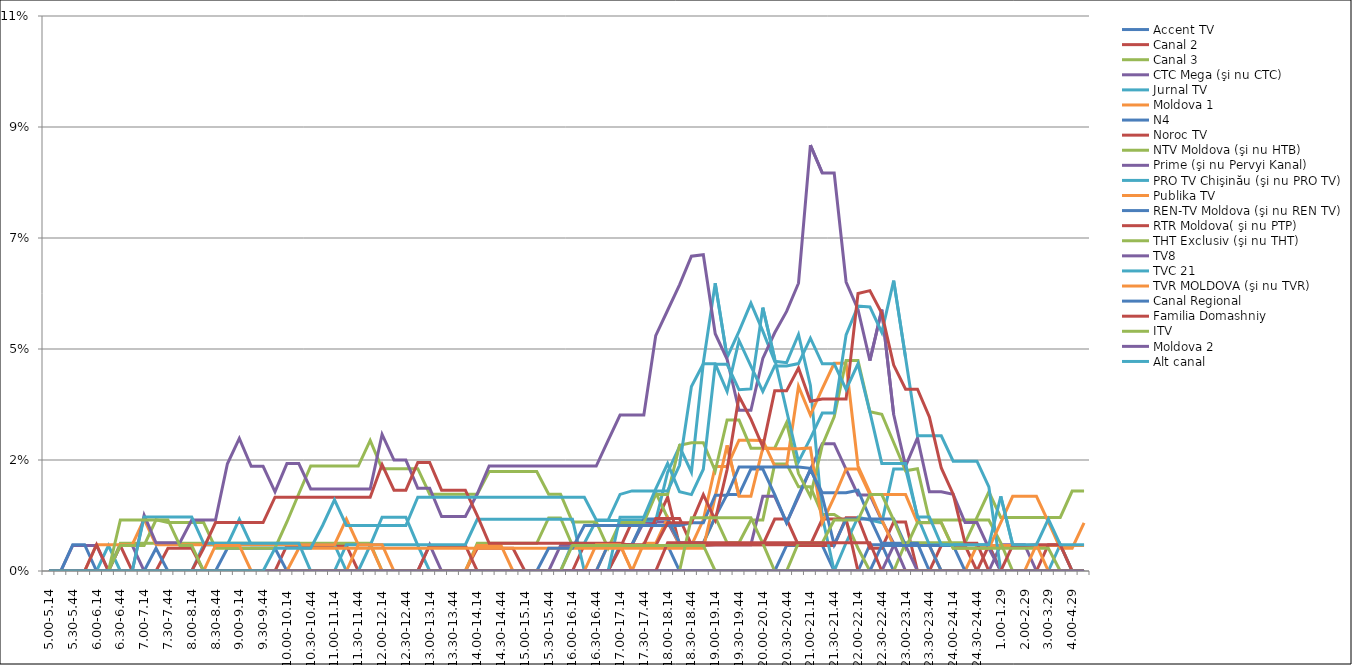
| Category | Accent TV | Canal 2 | Canal 3 | CTC Mega (şi nu CTC) | Jurnal TV | Moldova 1 | N4 | Noroc TV | NTV Moldova (şi nu HTB) | Prime (şi nu Pervyi Kanal) | PRO TV Chişinău (şi nu PRO TV) | Publika TV  | REN-TV Moldova (şi nu REN TV)  | RTR Moldova( şi nu PTP)  | THT Exclusiv (şi nu THT) | TV8 | TVC 21 | TVR MOLDOVA (şi nu TVR) | Canal Regional | Familia Domashniy | ITV | Moldova 2 | Alt canal |
|---|---|---|---|---|---|---|---|---|---|---|---|---|---|---|---|---|---|---|---|---|---|---|---|
| 5.00-5.14 | 0 | 0 | 0 | 0 | 0 | 0 | 0 | 0 | 0 | 0 | 0 | 0 | 0 | 0 | 0 | 0 | 0 | 0 | 0 | 0 | 0 | 0 | 0 |
| 5.15-5.29 | 0 | 0 | 0 | 0 | 0 | 0 | 0 | 0 | 0 | 0 | 0 | 0 | 0 | 0 | 0 | 0 | 0 | 0 | 0 | 0 | 0 | 0 | 0 |
| 5.30-5.44 | 0 | 0 | 0 | 0 | 0 | 0 | 0 | 0 | 0 | 0.005 | 0 | 0 | 0.005 | 0 | 0 | 0 | 0 | 0 | 0 | 0 | 0 | 0 | 0 |
| 5.45-5.59 | 0 | 0 | 0 | 0 | 0 | 0 | 0 | 0 | 0 | 0.005 | 0 | 0 | 0.005 | 0 | 0 | 0 | 0 | 0 | 0 | 0 | 0 | 0 | 0 |
| 6.00-6.14 | 0 | 0 | 0 | 0 | 0 | 0.005 | 0 | 0 | 0 | 0.005 | 0 | 0 | 0 | 0.005 | 0 | 0 | 0 | 0 | 0 | 0 | 0 | 0 | 0 |
| 6.15-6.29 | 0 | 0 | 0 | 0 | 0.005 | 0.005 | 0 | 0 | 0 | 0 | 0 | 0 | 0 | 0 | 0 | 0 | 0 | 0 | 0 | 0 | 0 | 0 | 0 |
| 6.30-6.44 | 0 | 0.005 | 0.006 | 0.005 | 0 | 0.005 | 0 | 0 | 0.005 | 0 | 0 | 0 | 0 | 0 | 0.01 | 0 | 0 | 0 | 0 | 0 | 0 | 0 | 0 |
| 6.45-6.59 | 0 | 0 | 0.006 | 0.005 | 0 | 0.005 | 0 | 0 | 0.005 | 0 | 0 | 0 | 0 | 0 | 0.01 | 0 | 0 | 0 | 0 | 0 | 0 | 0 | 0 |
| 7.00-7.14 | 0 | 0 | 0.006 | 0 | 0 | 0.01 | 0 | 0 | 0.005 | 0.011 | 0.011 | 0 | 0 | 0 | 0.01 | 0 | 0 | 0 | 0 | 0 | 0 | 0 | 0 |
| 7.15-7.29 | 0 | 0 | 0.006 | 0 | 0 | 0.005 | 0 | 0 | 0.01 | 0.006 | 0.011 | 0 | 0.005 | 0 | 0.01 | 0 | 0 | 0 | 0 | 0 | 0 | 0 | 0 |
| 7.30-7.44 | 0 | 0.005 | 0.006 | 0 | 0 | 0.005 | 0 | 0 | 0.01 | 0.006 | 0.011 | 0 | 0 | 0 | 0.01 | 0 | 0 | 0 | 0 | 0 | 0 | 0 | 0 |
| 7.45-7.59 | 0 | 0.005 | 0.006 | 0 | 0 | 0.005 | 0 | 0 | 0.01 | 0.006 | 0.011 | 0 | 0 | 0 | 0.005 | 0 | 0 | 0 | 0 | 0 | 0 | 0 | 0 |
| 8.00-8.14 | 0 | 0.005 | 0.006 | 0 | 0 | 0.005 | 0 | 0 | 0.01 | 0.01 | 0.011 | 0 | 0 | 0 | 0.005 | 0 | 0 | 0 | 0 | 0 | 0 | 0 | 0 |
| 8.15-8.29 | 0 | 0 | 0.006 | 0 | 0.005 | 0.005 | 0 | 0 | 0.01 | 0.01 | 0.006 | 0 | 0 | 0.005 | 0 | 0 | 0 | 0 | 0 | 0 | 0 | 0 | 0 |
| 8.30-8.44 | 0 | 0 | 0.006 | 0 | 0.005 | 0.005 | 0 | 0 | 0.005 | 0.01 | 0.006 | 0.005 | 0 | 0.01 | 0 | 0 | 0 | 0 | 0 | 0 | 0 | 0 | 0 |
| 8.45-8.59 | 0 | 0 | 0.006 | 0 | 0.005 | 0.005 | 0.005 | 0 | 0.005 | 0.022 | 0.006 | 0.005 | 0 | 0.01 | 0 | 0 | 0 | 0 | 0 | 0 | 0 | 0 | 0 |
| 9.00-9.14 | 0 | 0 | 0.006 | 0 | 0.01 | 0.005 | 0.005 | 0 | 0.005 | 0.027 | 0.006 | 0.005 | 0 | 0.01 | 0 | 0 | 0 | 0 | 0 | 0 | 0 | 0 | 0 |
| 9.15-9.29 | 0 | 0 | 0.006 | 0 | 0.005 | 0.005 | 0.005 | 0 | 0.005 | 0.021 | 0.006 | 0 | 0 | 0.01 | 0 | 0 | 0 | 0 | 0 | 0 | 0 | 0 | 0 |
| 9.30-9.44 | 0 | 0 | 0.006 | 0 | 0.005 | 0.005 | 0.005 | 0 | 0.005 | 0.021 | 0.006 | 0 | 0 | 0.01 | 0 | 0 | 0 | 0 | 0 | 0 | 0 | 0 | 0 |
| 9.45-9.59 | 0 | 0 | 0.006 | 0 | 0.005 | 0.005 | 0.005 | 0 | 0.005 | 0.016 | 0.006 | 0 | 0 | 0.015 | 0 | 0 | 0 | 0 | 0 | 0 | 0 | 0 | 0.005 |
| 10.00-10.14 | 0 | 0.005 | 0.006 | 0 | 0.005 | 0.005 | 0 | 0 | 0.01 | 0.022 | 0.006 | 0 | 0 | 0.015 | 0 | 0 | 0 | 0 | 0 | 0 | 0 | 0 | 0.005 |
| 10.15-10.29 | 0 | 0.005 | 0.006 | 0 | 0.005 | 0.005 | 0 | 0 | 0.016 | 0.022 | 0.006 | 0.005 | 0 | 0.015 | 0 | 0 | 0 | 0 | 0 | 0 | 0 | 0 | 0.005 |
| 10.30-10.44 | 0 | 0.005 | 0.006 | 0 | 0.005 | 0.005 | 0 | 0 | 0.021 | 0.017 | 0 | 0.005 | 0 | 0.015 | 0 | 0 | 0 | 0 | 0 | 0 | 0 | 0 | 0.005 |
| 10.45-10.59 | 0 | 0.005 | 0.006 | 0 | 0.005 | 0.005 | 0 | 0 | 0.021 | 0.017 | 0 | 0.005 | 0 | 0.015 | 0 | 0 | 0 | 0 | 0 | 0 | 0 | 0 | 0.009 |
| 11.00-11.14 | 0 | 0.005 | 0.006 | 0 | 0.005 | 0.005 | 0 | 0 | 0.021 | 0.017 | 0 | 0.005 | 0 | 0.015 | 0 | 0 | 0 | 0 | 0 | 0 | 0 | 0 | 0.014 |
| 11.15-11.29 | 0 | 0.005 | 0.006 | 0 | 0 | 0.011 | 0 | 0 | 0.021 | 0.017 | 0.005 | 0.005 | 0 | 0.015 | 0 | 0 | 0 | 0 | 0 | 0 | 0 | 0 | 0.009 |
| 11.30-11.44 | 0 | 0 | 0.006 | 0 | 0 | 0.005 | 0 | 0 | 0.021 | 0.017 | 0.005 | 0.005 | 0 | 0.015 | 0 | 0 | 0 | 0.005 | 0 | 0 | 0 | 0 | 0.009 |
| 11.45-11.59 | 0 | 0 | 0.006 | 0 | 0.005 | 0.005 | 0 | 0 | 0.026 | 0.017 | 0.005 | 0.005 | 0 | 0.015 | 0 | 0 | 0 | 0.005 | 0 | 0 | 0 | 0 | 0.009 |
| 12.00-12.14 | 0 | 0 | 0 | 0 | 0.011 | 0 | 0 | 0 | 0.021 | 0.028 | 0.005 | 0.005 | 0 | 0.022 | 0 | 0 | 0 | 0.005 | 0 | 0 | 0 | 0 | 0.009 |
| 12.15-12.29 | 0 | 0 | 0 | 0 | 0.011 | 0 | 0 | 0 | 0.021 | 0.022 | 0.005 | 0.005 | 0 | 0.016 | 0 | 0 | 0 | 0 | 0 | 0 | 0 | 0 | 0.009 |
| 12.30-12.44 | 0 | 0 | 0 | 0 | 0.011 | 0 | 0 | 0 | 0.021 | 0.022 | 0.005 | 0.005 | 0 | 0.016 | 0 | 0 | 0 | 0 | 0 | 0 | 0 | 0 | 0.009 |
| 12.45-12.59 | 0 | 0 | 0 | 0 | 0.005 | 0 | 0 | 0 | 0.021 | 0.017 | 0.005 | 0.005 | 0 | 0.022 | 0 | 0 | 0 | 0 | 0 | 0 | 0 | 0 | 0.015 |
| 13.00-13.14 | 0 | 0 | 0 | 0.005 | 0 | 0 | 0 | 0.005 | 0.016 | 0.017 | 0.005 | 0.005 | 0 | 0.022 | 0 | 0 | 0 | 0 | 0 | 0 | 0 | 0 | 0.015 |
| 13.15-13.29 | 0 | 0 | 0 | 0 | 0 | 0 | 0 | 0.005 | 0.016 | 0.011 | 0.005 | 0.005 | 0 | 0.016 | 0 | 0 | 0 | 0 | 0 | 0 | 0 | 0 | 0.015 |
| 13.30-13.44 | 0 | 0 | 0 | 0 | 0 | 0 | 0 | 0.005 | 0.016 | 0.011 | 0.005 | 0.005 | 0 | 0.016 | 0 | 0 | 0 | 0 | 0 | 0 | 0 | 0 | 0.015 |
| 13.45-13.59 | 0 | 0 | 0 | 0 | 0 | 0 | 0 | 0.005 | 0.016 | 0.011 | 0.005 | 0.005 | 0 | 0.016 | 0 | 0 | 0 | 0 | 0 | 0 | 0 | 0 | 0.015 |
| 14.00-14.14 | 0 | 0.005 | 0.006 | 0 | 0 | 0.005 | 0 | 0 | 0.016 | 0.016 | 0.01 | 0.005 | 0 | 0.011 | 0 | 0 | 0 | 0 | 0 | 0 | 0 | 0 | 0.015 |
| 14.15-14.29 | 0 | 0.005 | 0.006 | 0 | 0 | 0.005 | 0 | 0 | 0.02 | 0.021 | 0.01 | 0.005 | 0 | 0.006 | 0 | 0 | 0 | 0 | 0 | 0 | 0 | 0 | 0.015 |
| 14.30-14.44 | 0 | 0.005 | 0.006 | 0 | 0 | 0.005 | 0 | 0 | 0.02 | 0.021 | 0.01 | 0.005 | 0 | 0.006 | 0 | 0 | 0 | 0 | 0 | 0 | 0 | 0 | 0.015 |
| 14.45-14.59 | 0 | 0.005 | 0.006 | 0 | 0 | 0 | 0 | 0 | 0.02 | 0.021 | 0.01 | 0.005 | 0 | 0.006 | 0 | 0 | 0 | 0 | 0 | 0 | 0 | 0 | 0.015 |
| 15.00-15.14 | 0 | 0 | 0.006 | 0 | 0 | 0 | 0 | 0 | 0.02 | 0.021 | 0.01 | 0.005 | 0 | 0.006 | 0 | 0 | 0 | 0 | 0 | 0 | 0 | 0 | 0.015 |
| 15.15-15.29 | 0 | 0 | 0.006 | 0 | 0 | 0 | 0 | 0 | 0.02 | 0.021 | 0.01 | 0.005 | 0 | 0.006 | 0 | 0 | 0 | 0 | 0 | 0 | 0 | 0 | 0.015 |
| 15.30-15.44 | 0 | 0 | 0.011 | 0 | 0 | 0 | 0 | 0 | 0.016 | 0.021 | 0.01 | 0.005 | 0.005 | 0.006 | 0 | 0 | 0 | 0 | 0 | 0 | 0 | 0 | 0.015 |
| 15.45-15.59 | 0 | 0 | 0.011 | 0.005 | 0 | 0 | 0 | 0 | 0.016 | 0.021 | 0.01 | 0.005 | 0.005 | 0.006 | 0 | 0 | 0 | 0 | 0 | 0 | 0 | 0 | 0.015 |
| 16.00-16.14 | 0 | 0 | 0.005 | 0.005 | 0.006 | 0 | 0 | 0 | 0.01 | 0.021 | 0.01 | 0.005 | 0.005 | 0.006 | 0 | 0 | 0 | 0 | 0 | 0 | 0.005 | 0 | 0.015 |
| 16.15-16.29 | 0 | 0 | 0.005 | 0.005 | 0.006 | 0 | 0 | 0.005 | 0.01 | 0.021 | 0 | 0.005 | 0.009 | 0.006 | 0 | 0 | 0 | 0 | 0 | 0 | 0.005 | 0 | 0.015 |
| 16.30-16.44 | 0 | 0 | 0.005 | 0.005 | 0.01 | 0 | 0 | 0.005 | 0.01 | 0.021 | 0 | 0.005 | 0.009 | 0.006 | 0 | 0 | 0 | 0.005 | 0 | 0 | 0.005 | 0 | 0.01 |
| 16.45-16.59 | 0 | 0 | 0.005 | 0.005 | 0.01 | 0.005 | 0.005 | 0.005 | 0.005 | 0.026 | 0 | 0.005 | 0.009 | 0.006 | 0 | 0 | 0 | 0.005 | 0 | 0 | 0.005 | 0 | 0.01 |
| 17.00-17.14 | 0.005 | 0.005 | 0.005 | 0.005 | 0.01 | 0.005 | 0.005 | 0.005 | 0.01 | 0.032 | 0.011 | 0.005 | 0.009 | 0.006 | 0 | 0 | 0 | 0.005 | 0 | 0 | 0.005 | 0 | 0.016 |
| 17.15-17.29 | 0.005 | 0.01 | 0.005 | 0.005 | 0.01 | 0 | 0.005 | 0.005 | 0.01 | 0.032 | 0.011 | 0.005 | 0.009 | 0.005 | 0 | 0 | 0 | 0 | 0 | 0 | 0.005 | 0 | 0.016 |
| 17.30-17.44 | 0.005 | 0.01 | 0.01 | 0.01 | 0.01 | 0.006 | 0.011 | 0.005 | 0.01 | 0.032 | 0.011 | 0.005 | 0.009 | 0.005 | 0 | 0 | 0 | 0 | 0 | 0 | 0.005 | 0 | 0.016 |
| 17.45-17.59 | 0.005 | 0.01 | 0.016 | 0.01 | 0.01 | 0.006 | 0.011 | 0.011 | 0.016 | 0.048 | 0.017 | 0.005 | 0.009 | 0.005 | 0 | 0 | 0 | 0 | 0 | 0 | 0.005 | 0 | 0.016 |
| 18.00-18.14 | 0.005 | 0.015 | 0.011 | 0.01 | 0.02 | 0.011 | 0.011 | 0.011 | 0.016 | 0.053 | 0.022 | 0.005 | 0.009 | 0.01 | 0 | 0 | 0 | 0 | 0 | 0.006 | 0.005 | 0 | 0.016 |
| 18.15-18.29 | 0 | 0.005 | 0.006 | 0.005 | 0.025 | 0.005 | 0.006 | 0.011 | 0.025 | 0.058 | 0.016 | 0.005 | 0.009 | 0.01 | 0 | 0 | 0 | 0 | 0 | 0.006 | 0.005 | 0 | 0.021 |
| 18.30-18.44 | 0 | 0.005 | 0.006 | 0.005 | 0.02 | 0.005 | 0.006 | 0.005 | 0.026 | 0.064 | 0.015 | 0.005 | 0.01 | 0.01 | 0.011 | 0 | 0 | 0 | 0 | 0.006 | 0.005 | 0 | 0.037 |
| 18.45-18.59 | 0 | 0.005 | 0.006 | 0.005 | 0.042 | 0.01 | 0.006 | 0.005 | 0.026 | 0.064 | 0.021 | 0.005 | 0.01 | 0.015 | 0.011 | 0 | 0 | 0 | 0 | 0.006 | 0.005 | 0 | 0.042 |
| 19.00-19.14 | 0 | 0.005 | 0.011 | 0.005 | 0.058 | 0.021 | 0.011 | 0.005 | 0.02 | 0.048 | 0.042 | 0.015 | 0.015 | 0.01 | 0.011 | 0 | 0 | 0 | 0 | 0.006 | 0 | 0 | 0.042 |
| 19.15-19.29 | 0 | 0.005 | 0.006 | 0.005 | 0.043 | 0.021 | 0.016 | 0.005 | 0.031 | 0.043 | 0.042 | 0.025 | 0.015 | 0.021 | 0.011 | 0 | 0 | 0 | 0 | 0.006 | 0 | 0 | 0.036 |
| 19.30-19.44 | 0 | 0.005 | 0.006 | 0.005 | 0.049 | 0.027 | 0.016 | 0.005 | 0.031 | 0.033 | 0.037 | 0.015 | 0.021 | 0.035 | 0.011 | 0 | 0 | 0 | 0 | 0.006 | 0 | 0 | 0.047 |
| 19.45-19.59 | 0 | 0.005 | 0.01 | 0.005 | 0.054 | 0.027 | 0.021 | 0.005 | 0.025 | 0.033 | 0.037 | 0.015 | 0.021 | 0.031 | 0.011 | 0 | 0 | 0 | 0 | 0.006 | 0 | 0 | 0.042 |
| 20.00-20.14 | 0 | 0.005 | 0.01 | 0.015 | 0.049 | 0.026 | 0.021 | 0.005 | 0.025 | 0.043 | 0.053 | 0.025 | 0.021 | 0.025 | 0.006 | 0 | 0 | 0 | 0 | 0.006 | 0 | 0 | 0.036 |
| 20.15-20.29 | 0 | 0.011 | 0.022 | 0.015 | 0.043 | 0.021 | 0.015 | 0.005 | 0.025 | 0.048 | 0.043 | 0.025 | 0.021 | 0.037 | 0 | 0 | 0 | 0 | 0 | 0.006 | 0 | 0 | 0.042 |
| 20.30-20.44 | 0.005 | 0.011 | 0.022 | 0.01 | 0.042 | 0.021 | 0.01 | 0.005 | 0.03 | 0.053 | 0.032 | 0.025 | 0.021 | 0.037 | 0 | 0 | 0 | 0 | 0 | 0.006 | 0 | 0 | 0.042 |
| 20.45-20.59 | 0.005 | 0.005 | 0.017 | 0.015 | 0.048 | 0.037 | 0.015 | 0.005 | 0.02 | 0.058 | 0.022 | 0.025 | 0.021 | 0.041 | 0.006 | 0 | 0 | 0 | 0 | 0.006 | 0 | 0 | 0.042 |
| 21.00-21.14 | 0.005 | 0.005 | 0.017 | 0.021 | 0.038 | 0.032 | 0.021 | 0.005 | 0.015 | 0.086 | 0.027 | 0.025 | 0.021 | 0.034 | 0.006 | 0 | 0 | 0 | 0 | 0.006 | 0 | 0 | 0.047 |
| 21.15-21.29 | 0.005 | 0.005 | 0.011 | 0.026 | 0.011 | 0.037 | 0.016 | 0.011 | 0.026 | 0.081 | 0.032 | 0.01 | 0.015 | 0.035 | 0.006 | 0 | 0 | 0 | 0 | 0.006 | 0 | 0 | 0.042 |
| 21.30-21.44 | 0 | 0.005 | 0.011 | 0.026 | 0 | 0.042 | 0.016 | 0.011 | 0.031 | 0.081 | 0.032 | 0.015 | 0.005 | 0.035 | 0.01 | 0 | 0 | 0 | 0 | 0.006 | 0 | 0 | 0.042 |
| 21.45-21.59 | 0 | 0.011 | 0.01 | 0.021 | 0.006 | 0.042 | 0.016 | 0.011 | 0.043 | 0.059 | 0.048 | 0.021 | 0.011 | 0.035 | 0.01 | 0 | 0 | 0 | 0 | 0.006 | 0 | 0 | 0.037 |
| 22.00-22.14 | 0 | 0.011 | 0.005 | 0.015 | 0.011 | 0.021 | 0.016 | 0 | 0.043 | 0.053 | 0.054 | 0.021 | 0.011 | 0.056 | 0.01 | 0 | 0 | 0 | 0 | 0.006 | 0 | 0 | 0.042 |
| 22.15-22.29 | 0.005 | 0.005 | 0 | 0.015 | 0.01 | 0.016 | 0.011 | 0 | 0.032 | 0.043 | 0.054 | 0.015 | 0.011 | 0.057 | 0.015 | 0 | 0 | 0 | 0 | 0.006 | 0 | 0 | 0.032 |
| 22.30-22.44 | 0.005 | 0.005 | 0 | 0.01 | 0.01 | 0.01 | 0.006 | 0 | 0.032 | 0.053 | 0.048 | 0.015 | 0.011 | 0.052 | 0.015 | 0 | 0 | 0 | 0.005 | 0 | 0 | 0 | 0.022 |
| 22.45-22.59 | 0 | 0.01 | 0 | 0.006 | 0.021 | 0.005 | 0.006 | 0 | 0.026 | 0.032 | 0.059 | 0.015 | 0.011 | 0.042 | 0.01 | 0.005 | 0 | 0 | 0.005 | 0 | 0 | 0 | 0.022 |
| 23.00-23.14 | 0 | 0.01 | 0.006 | 0 | 0.021 | 0.005 | 0.006 | 0 | 0.02 | 0.021 | 0.043 | 0.015 | 0.005 | 0.037 | 0.005 | 0.005 | 0 | 0 | 0.005 | 0 | 0 | 0 | 0.022 |
| 23.15-23.29 | 0 | 0 | 0.006 | 0 | 0.011 | 0.005 | 0.006 | 0 | 0.021 | 0.027 | 0.027 | 0.01 | 0.005 | 0.037 | 0.01 | 0 | 0 | 0 | 0.005 | 0 | 0 | 0 | 0.011 |
| 23.30-23.44 | 0 | 0 | 0.006 | 0 | 0.005 | 0.005 | 0 | 0 | 0.01 | 0.016 | 0.027 | 0.01 | 0.005 | 0.031 | 0.01 | 0 | 0 | 0 | 0.005 | 0 | 0 | 0 | 0.011 |
| 23.45-23.59 | 0 | 0.005 | 0.006 | 0 | 0.005 | 0 | 0 | 0 | 0.01 | 0.016 | 0.027 | 0.01 | 0.005 | 0.021 | 0.01 | 0 | 0 | 0 | 0 | 0 | 0 | 0 | 0.005 |
| 24.00-24.14 | 0 | 0.005 | 0.006 | 0 | 0.005 | 0 | 0 | 0 | 0.01 | 0.016 | 0.022 | 0.005 | 0.005 | 0.016 | 0.005 | 0 | 0 | 0 | 0 | 0 | 0 | 0 | 0.005 |
| 24.15-24.29 | 0 | 0.005 | 0.006 | 0 | 0.005 | 0 | 0 | 0 | 0.01 | 0.01 | 0.022 | 0.005 | 0 | 0.006 | 0.005 | 0 | 0 | 0 | 0 | 0 | 0 | 0 | 0.005 |
| 24.30-24.44 | 0 | 0 | 0.011 | 0 | 0.005 | 0.005 | 0 | 0 | 0.01 | 0.01 | 0.022 | 0.005 | 0 | 0.006 | 0.005 | 0 | 0 | 0 | 0 | 0 | 0 | 0 | 0.005 |
| 24.45-24.59 | 0 | 0 | 0.016 | 0 | 0.005 | 0.005 | 0 | 0.005 | 0.01 | 0.005 | 0.017 | 0.005 | 0 | 0 | 0.005 | 0 | 0 | 0 | 0 | 0 | 0 | 0 | 0.005 |
| 1.00-1.29 | 0 | 0 | 0.011 | 0.005 | 0 | 0.005 | 0 | 0 | 0.006 | 0 | 0 | 0.01 | 0 | 0 | 0.005 | 0 | 0 | 0 | 0 | 0 | 0 | 0 | 0.015 |
| 1.30-1. 59 | 0 | 0 | 0.011 | 0.005 | 0 | 0.005 | 0 | 0 | 0 | 0 | 0 | 0.015 | 0 | 0.005 | 0.005 | 0 | 0 | 0 | 0 | 0 | 0 | 0 | 0.005 |
| 2.00-2.29 | 0 | 0 | 0.011 | 0.005 | 0 | 0.005 | 0 | 0 | 0 | 0 | 0 | 0.015 | 0 | 0.005 | 0.005 | 0 | 0 | 0 | 0 | 0 | 0 | 0 | 0.005 |
| 2.30-2.59 | 0 | 0 | 0.011 | 0 | 0 | 0.005 | 0 | 0 | 0 | 0 | 0 | 0.015 | 0 | 0.005 | 0.005 | 0 | 0 | 0.005 | 0 | 0 | 0 | 0 | 0.005 |
| 3.00-3.29 | 0 | 0 | 0.011 | 0 | 0 | 0.005 | 0 | 0.005 | 0 | 0 | 0 | 0.01 | 0 | 0.005 | 0.005 | 0 | 0 | 0 | 0 | 0 | 0 | 0 | 0.011 |
| 3.30-3.59 | 0 | 0 | 0.011 | 0 | 0 | 0.005 | 0 | 0.005 | 0 | 0 | 0.005 | 0.005 | 0 | 0.005 | 0 | 0 | 0 | 0 | 0 | 0 | 0 | 0 | 0.005 |
| 4.00-4.29 | 0 | 0 | 0.016 | 0 | 0 | 0.005 | 0 | 0 | 0 | 0 | 0 | 0.005 | 0 | 0 | 0 | 0 | 0 | 0 | 0 | 0 | 0 | 0 | 0.005 |
| 4.30-4.59 | 0 | 0 | 0.016 | 0 | 0 | 0.005 | 0 | 0 | 0 | 0 | 0 | 0.01 | 0 | 0 | 0 | 0 | 0 | 0 | 0 | 0 | 0 | 0 | 0.005 |